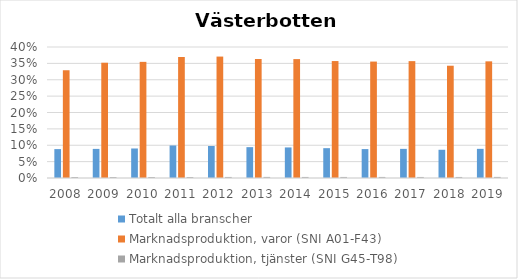
| Category | Totalt alla branscher | Marknadsproduktion, varor (SNI A01-F43) | Marknadsproduktion, tjänster (SNI G45-T98) |
|---|---|---|---|
| 2008.0 | 0.088 | 0.329 | 0.003 |
| 2009.0 | 0.089 | 0.352 | 0.003 |
| 2010.0 | 0.09 | 0.355 | 0.003 |
| 2011.0 | 0.099 | 0.369 | 0.003 |
| 2012.0 | 0.098 | 0.371 | 0.003 |
| 2013.0 | 0.094 | 0.363 | 0.003 |
| 2014.0 | 0.093 | 0.363 | 0.003 |
| 2015.0 | 0.091 | 0.357 | 0.003 |
| 2016.0 | 0.088 | 0.356 | 0.003 |
| 2017.0 | 0.089 | 0.357 | 0.003 |
| 2018.0 | 0.086 | 0.343 | 0.003 |
| 2019.0 | 0.089 | 0.356 | 0.003 |